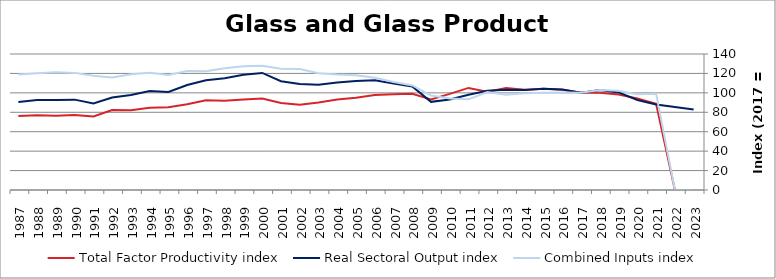
| Category | Total Factor Productivity index | Real Sectoral Output index | Combined Inputs index |
|---|---|---|---|
| 2023.0 | 0 | 82.811 | 0 |
| 2022.0 | 0 | 85.546 | 0 |
| 2021.0 | 88.679 | 87.932 | 99.158 |
| 2020.0 | 94.16 | 92.696 | 98.445 |
| 2019.0 | 98.368 | 100.445 | 102.111 |
| 2018.0 | 100.11 | 103.043 | 102.93 |
| 2017.0 | 100 | 100 | 100 |
| 2016.0 | 103.148 | 103.533 | 100.373 |
| 2015.0 | 104.303 | 104.317 | 100.013 |
| 2014.0 | 103.203 | 102.83 | 99.639 |
| 2013.0 | 105.002 | 103.071 | 98.162 |
| 2012.0 | 101.213 | 102.15 | 100.926 |
| 2011.0 | 105.083 | 98.093 | 93.348 |
| 2010.0 | 98.944 | 93.213 | 94.208 |
| 2009.0 | 93.293 | 90.741 | 97.264 |
| 2008.0 | 99.049 | 106.646 | 107.67 |
| 2007.0 | 98.591 | 109.522 | 111.087 |
| 2006.0 | 97.768 | 113.002 | 115.581 |
| 2005.0 | 94.971 | 112.233 | 118.176 |
| 2004.0 | 93.098 | 110.636 | 118.837 |
| 2003.0 | 90.077 | 108.294 | 120.224 |
| 2002.0 | 87.736 | 109.174 | 124.435 |
| 2001.0 | 89.656 | 112.009 | 124.932 |
| 2000.0 | 94.258 | 120.516 | 127.857 |
| 1999.0 | 93.128 | 118.581 | 127.331 |
| 1998.0 | 91.785 | 115.028 | 125.323 |
| 1997.0 | 92.44 | 113.036 | 122.28 |
| 1996.0 | 88.263 | 108.033 | 122.399 |
| 1995.0 | 85.23 | 100.903 | 118.389 |
| 1994.0 | 84.56 | 101.966 | 120.585 |
| 1993.0 | 82.18 | 97.862 | 119.082 |
| 1992.0 | 82.238 | 95.3 | 115.883 |
| 1991.0 | 75.786 | 89.173 | 117.665 |
| 1990.0 | 77.159 | 93.029 | 120.568 |
| 1989.0 | 76.548 | 92.772 | 121.195 |
| 1988.0 | 77.073 | 92.604 | 120.151 |
| 1987.0 | 76.253 | 90.663 | 118.897 |